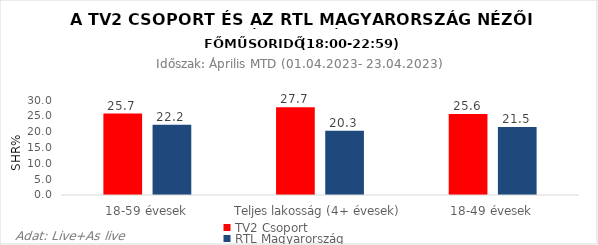
| Category | TV2 Csoport | RTL Magyarország |
|---|---|---|
| 18-59 évesek | 25.7 | 22.2 |
| Teljes lakosság (4+ évesek) | 27.7 | 20.3 |
| 18-49 évesek | 25.6 | 21.5 |